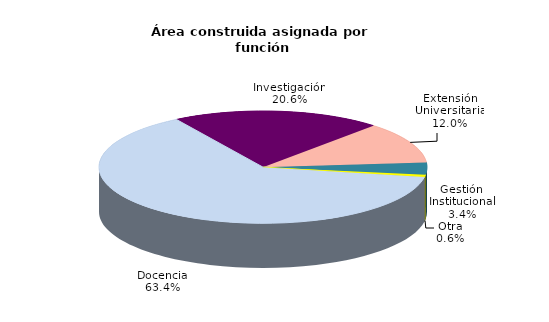
| Category | Series 0 |
|---|---|
| Docencia | 63.371 |
| Investigación | 20.609 |
| Extensión Universitaria | 11.947 |
| Gestión Institucional | 3.435 |
| Otra | 0.638 |